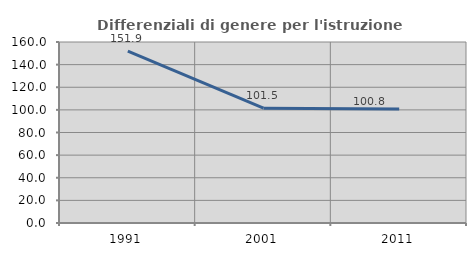
| Category | Differenziali di genere per l'istruzione superiore |
|---|---|
| 1991.0 | 151.863 |
| 2001.0 | 101.477 |
| 2011.0 | 100.775 |